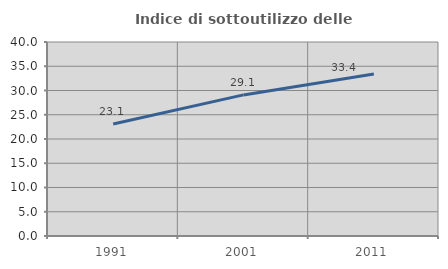
| Category | Indice di sottoutilizzo delle abitazioni  |
|---|---|
| 1991.0 | 23.077 |
| 2001.0 | 29.091 |
| 2011.0 | 33.387 |